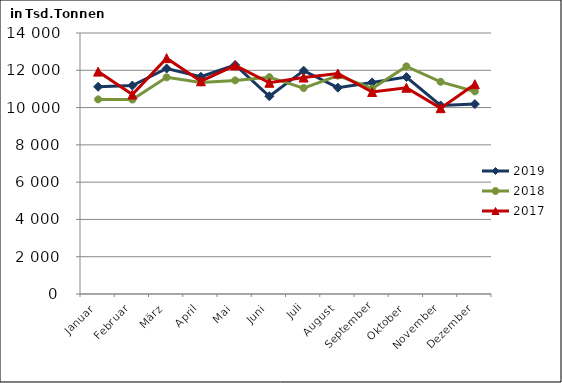
| Category | 2019 | 2018 | 2017 |
|---|---|---|---|
| Januar | 11115.4 | 10439.5 | 11929.047 |
| Februar | 11182.8 | 10428.9 | 10695.71 |
| März | 12095.5 | 11620.8 | 12650.97 |
| April | 11651.679 | 11346.4 | 11413.511 |
| Mai | 12285.699 | 11457.8 | 12262.781 |
| Juni | 10605.833 | 11631.2 | 11331.271 |
| Juli | 11979.512 | 11046.8 | 11611.336 |
| August | 11067.476 | 11713.4 | 11824.714 |
| September | 11349.908 | 11021.8 | 10834.028 |
| Oktober | 11638 | 12210.1 | 11064.287 |
| November | 10113.2 | 11381.2 | 9968.597 |
| Dezember | 10185.7 | 10865.2 | 11252.284 |